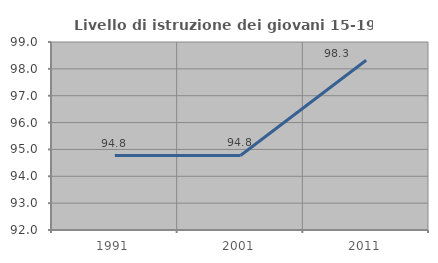
| Category | Livello di istruzione dei giovani 15-19 anni |
|---|---|
| 1991.0 | 94.771 |
| 2001.0 | 94.776 |
| 2011.0 | 98.319 |